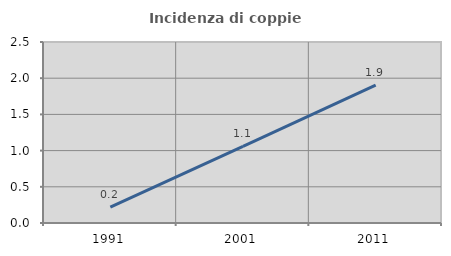
| Category | Incidenza di coppie miste |
|---|---|
| 1991.0 | 0.218 |
| 2001.0 | 1.06 |
| 2011.0 | 1.905 |